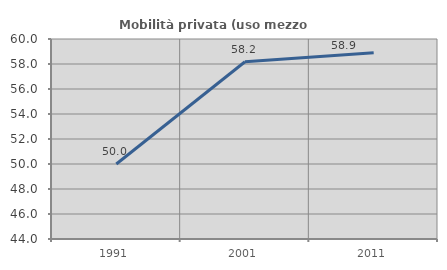
| Category | Mobilità privata (uso mezzo privato) |
|---|---|
| 1991.0 | 50 |
| 2001.0 | 58.177 |
| 2011.0 | 58.901 |